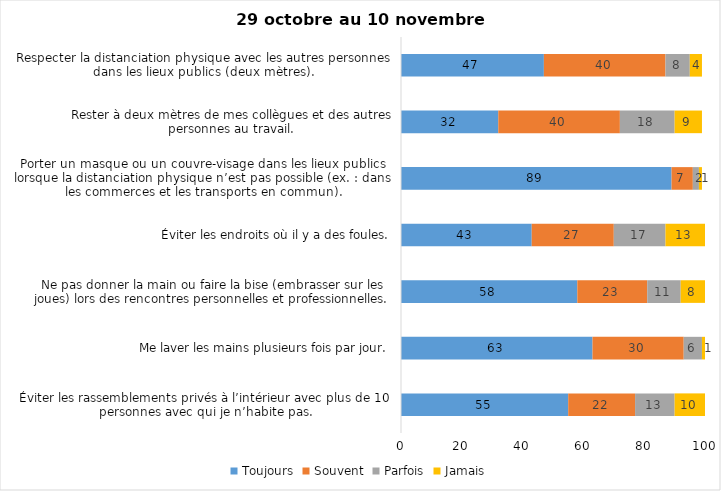
| Category | Toujours | Souvent | Parfois | Jamais |
|---|---|---|---|---|
| Éviter les rassemblements privés à l’intérieur avec plus de 10 personnes avec qui je n’habite pas. | 55 | 22 | 13 | 10 |
| Me laver les mains plusieurs fois par jour. | 63 | 30 | 6 | 1 |
| Ne pas donner la main ou faire la bise (embrasser sur les joues) lors des rencontres personnelles et professionnelles. | 58 | 23 | 11 | 8 |
| Éviter les endroits où il y a des foules. | 43 | 27 | 17 | 13 |
| Porter un masque ou un couvre-visage dans les lieux publics lorsque la distanciation physique n’est pas possible (ex. : dans les commerces et les transports en commun). | 89 | 7 | 2 | 1 |
| Rester à deux mètres de mes collègues et des autres personnes au travail. | 32 | 40 | 18 | 9 |
| Respecter la distanciation physique avec les autres personnes dans les lieux publics (deux mètres). | 47 | 40 | 8 | 4 |